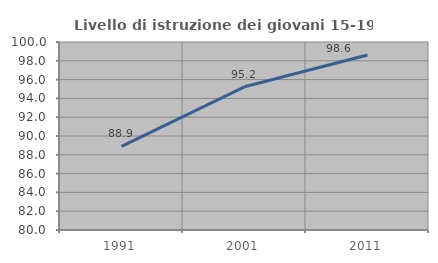
| Category | Livello di istruzione dei giovani 15-19 anni |
|---|---|
| 1991.0 | 88.889 |
| 2001.0 | 95.232 |
| 2011.0 | 98.609 |